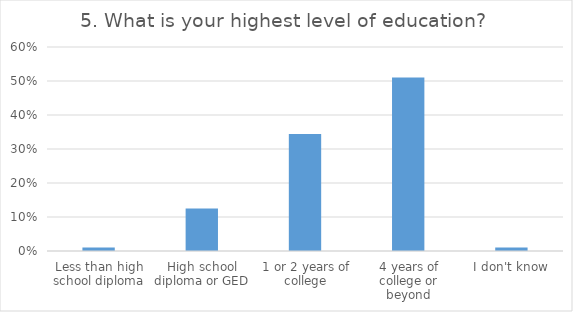
| Category | 5. What is your highest level of education?  |
|---|---|
| Less than high school diploma | 0.01 |
| High school diploma or GED | 0.125 |
| 1 or 2 years of college | 0.344 |
| 4 years of college or beyond | 0.51 |
| I don't know | 0.01 |